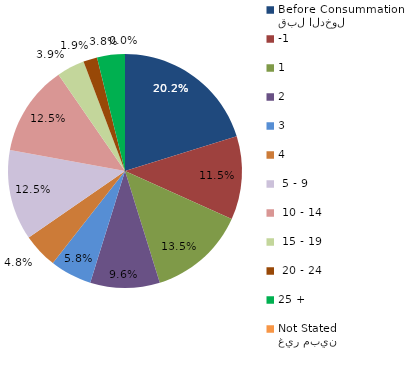
| Category | Series 0 |
|---|---|
| قبل الدخول
Before Consummation | 20.192 |
| -1 | 11.538 |
| 1 | 13.462 |
| 2 | 9.615 |
| 3 | 5.769 |
| 4 | 4.808 |
|  5 - 9 | 12.5 |
|  10 - 14 | 12.5 |
|  15 - 19 | 3.846 |
|  20 - 24 | 1.923 |
| 25 + | 3.846 |
| غير مبين
Not Stated | 0 |